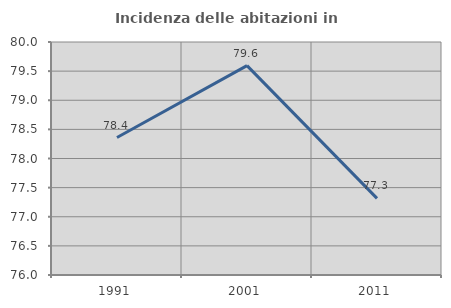
| Category | Incidenza delle abitazioni in proprietà  |
|---|---|
| 1991.0 | 78.36 |
| 2001.0 | 79.594 |
| 2011.0 | 77.315 |